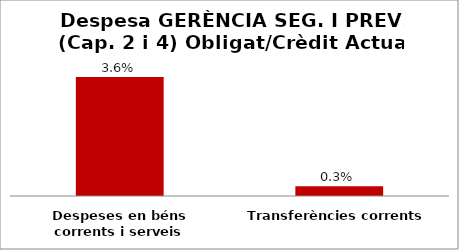
| Category | Series 0 |
|---|---|
| Despeses en béns corrents i serveis | 0.036 |
| Transferències corrents | 0.003 |